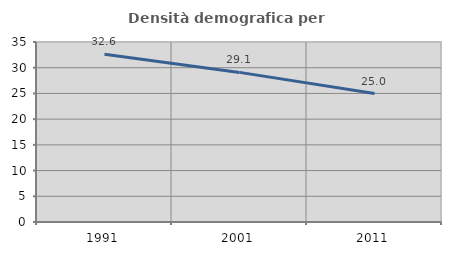
| Category | Densità demografica |
|---|---|
| 1991.0 | 32.608 |
| 2001.0 | 29.091 |
| 2011.0 | 24.978 |